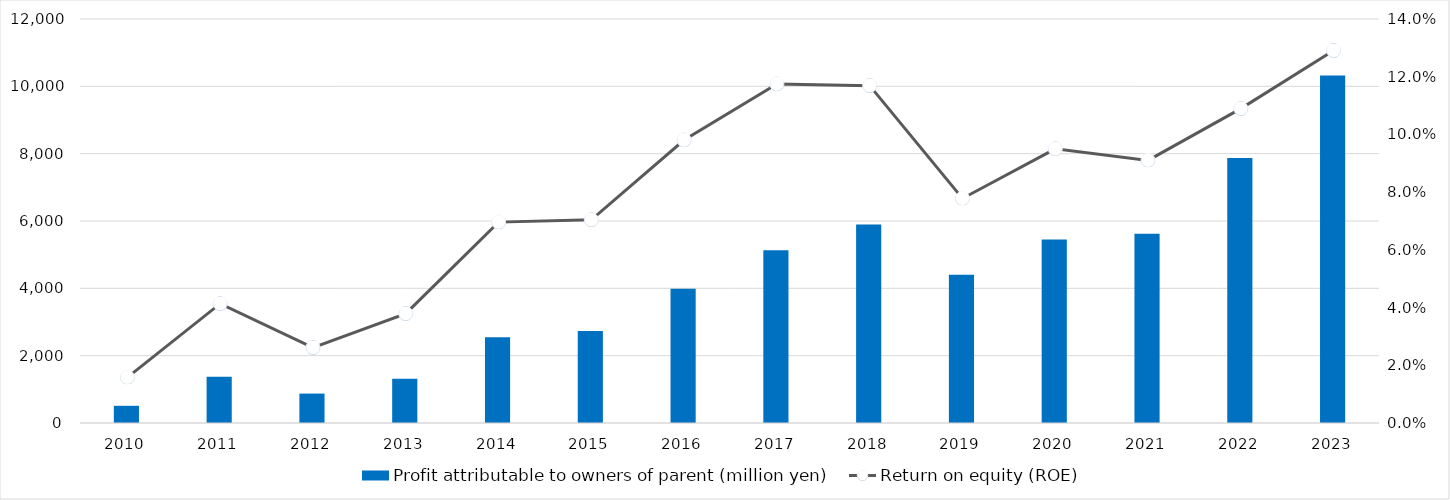
| Category | Profit attributable to owners of parent (million yen) |
|---|---|
| 2010 | 511 |
| 2011 | 1375 |
| 2012 | 874 |
| 2013 | 1318 |
| 2014 | 2546 |
| 2015 | 2736 |
| 2016 | 3988 |
| 2017 | 5132 |
| 2018 | 5895 |
| 2019 | 4402 |
| 2020 | 5447 |
| 2021 | 5620 |
| 2022 | 7872 |
| 2023 | 10325 |